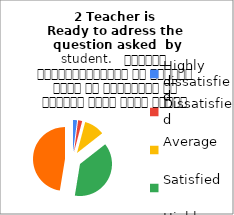
| Category | 2 Teacher is 
Ready to adress the  question asked  by student.   शिक्षक विद्यार्थियों के द्वारा पूछे गए प्रश्नों का समाधान करने हेतु तत्पर रहते हैं |
|---|---|
| Highly dissatisfied | 2 |
| Dissatisfied | 2 |
| Average | 10 |
| Satisfied | 37 |
| Highly satisfied | 46 |